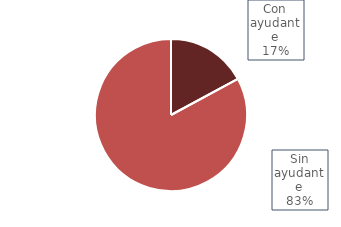
| Category | Series 0 |
|---|---|
| Con ayudante | 0.147 |
| Sin ayudante | 0.712 |